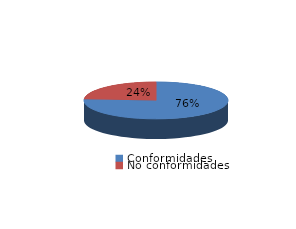
| Category | Series 0 |
|---|---|
| Conformidades | 1477 |
| No conformidades | 464 |